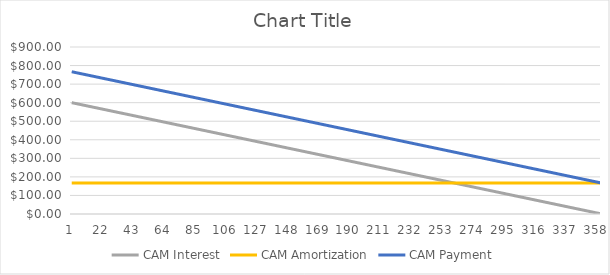
| Category | CAM Interest | CAM Amortization | CAM Payment |
|---|---|---|---|
| 0 | 600 | 166.667 | 766.667 |
| 1 | 598.333 | 166.667 | 765 |
| 2 | 596.667 | 166.667 | 763.333 |
| 3 | 595 | 166.667 | 761.667 |
| 4 | 593.333 | 166.667 | 760 |
| 5 | 591.667 | 166.667 | 758.333 |
| 6 | 590 | 166.667 | 756.667 |
| 7 | 588.333 | 166.667 | 755 |
| 8 | 586.667 | 166.667 | 753.333 |
| 9 | 585 | 166.667 | 751.667 |
| 10 | 583.333 | 166.667 | 750 |
| 11 | 581.667 | 166.667 | 748.333 |
| 12 | 580 | 166.667 | 746.667 |
| 13 | 578.333 | 166.667 | 745 |
| 14 | 576.667 | 166.667 | 743.333 |
| 15 | 575 | 166.667 | 741.667 |
| 16 | 573.333 | 166.667 | 740 |
| 17 | 571.667 | 166.667 | 738.333 |
| 18 | 570 | 166.667 | 736.667 |
| 19 | 568.333 | 166.667 | 735 |
| 20 | 566.667 | 166.667 | 733.333 |
| 21 | 565 | 166.667 | 731.667 |
| 22 | 563.333 | 166.667 | 730 |
| 23 | 561.667 | 166.667 | 728.333 |
| 24 | 560 | 166.667 | 726.667 |
| 25 | 558.333 | 166.667 | 725 |
| 26 | 556.667 | 166.667 | 723.333 |
| 27 | 555 | 166.667 | 721.667 |
| 28 | 553.333 | 166.667 | 720 |
| 29 | 551.667 | 166.667 | 718.333 |
| 30 | 550 | 166.667 | 716.667 |
| 31 | 548.333 | 166.667 | 715 |
| 32 | 546.667 | 166.667 | 713.333 |
| 33 | 545 | 166.667 | 711.667 |
| 34 | 543.333 | 166.667 | 710 |
| 35 | 541.667 | 166.667 | 708.333 |
| 36 | 540 | 166.667 | 706.667 |
| 37 | 538.333 | 166.667 | 705 |
| 38 | 536.667 | 166.667 | 703.333 |
| 39 | 535 | 166.667 | 701.667 |
| 40 | 533.333 | 166.667 | 700 |
| 41 | 531.667 | 166.667 | 698.333 |
| 42 | 530 | 166.667 | 696.667 |
| 43 | 528.333 | 166.667 | 695 |
| 44 | 526.667 | 166.667 | 693.333 |
| 45 | 525 | 166.667 | 691.667 |
| 46 | 523.333 | 166.667 | 690 |
| 47 | 521.667 | 166.667 | 688.333 |
| 48 | 520 | 166.667 | 686.667 |
| 49 | 518.333 | 166.667 | 685 |
| 50 | 516.667 | 166.667 | 683.333 |
| 51 | 515 | 166.667 | 681.667 |
| 52 | 513.333 | 166.667 | 680 |
| 53 | 511.667 | 166.667 | 678.333 |
| 54 | 510 | 166.667 | 676.667 |
| 55 | 508.333 | 166.667 | 675 |
| 56 | 506.667 | 166.667 | 673.333 |
| 57 | 505 | 166.667 | 671.667 |
| 58 | 503.333 | 166.667 | 670 |
| 59 | 501.667 | 166.667 | 668.333 |
| 60 | 500 | 166.667 | 666.667 |
| 61 | 498.333 | 166.667 | 665 |
| 62 | 496.667 | 166.667 | 663.333 |
| 63 | 495 | 166.667 | 661.667 |
| 64 | 493.333 | 166.667 | 660 |
| 65 | 491.667 | 166.667 | 658.333 |
| 66 | 490 | 166.667 | 656.667 |
| 67 | 488.333 | 166.667 | 655 |
| 68 | 486.667 | 166.667 | 653.333 |
| 69 | 485 | 166.667 | 651.667 |
| 70 | 483.333 | 166.667 | 650 |
| 71 | 481.667 | 166.667 | 648.333 |
| 72 | 480 | 166.667 | 646.667 |
| 73 | 478.333 | 166.667 | 645 |
| 74 | 476.667 | 166.667 | 643.333 |
| 75 | 475 | 166.667 | 641.667 |
| 76 | 473.333 | 166.667 | 640 |
| 77 | 471.667 | 166.667 | 638.333 |
| 78 | 470 | 166.667 | 636.667 |
| 79 | 468.333 | 166.667 | 635 |
| 80 | 466.667 | 166.667 | 633.333 |
| 81 | 465 | 166.667 | 631.667 |
| 82 | 463.333 | 166.667 | 630 |
| 83 | 461.667 | 166.667 | 628.333 |
| 84 | 460 | 166.667 | 626.667 |
| 85 | 458.333 | 166.667 | 625 |
| 86 | 456.667 | 166.667 | 623.333 |
| 87 | 455 | 166.667 | 621.667 |
| 88 | 453.333 | 166.667 | 620 |
| 89 | 451.667 | 166.667 | 618.333 |
| 90 | 450 | 166.667 | 616.667 |
| 91 | 448.333 | 166.667 | 615 |
| 92 | 446.667 | 166.667 | 613.333 |
| 93 | 445 | 166.667 | 611.667 |
| 94 | 443.333 | 166.667 | 610 |
| 95 | 441.667 | 166.667 | 608.333 |
| 96 | 440 | 166.667 | 606.667 |
| 97 | 438.333 | 166.667 | 605 |
| 98 | 436.667 | 166.667 | 603.333 |
| 99 | 435 | 166.667 | 601.667 |
| 100 | 433.333 | 166.667 | 600 |
| 101 | 431.667 | 166.667 | 598.333 |
| 102 | 430 | 166.667 | 596.667 |
| 103 | 428.333 | 166.667 | 595 |
| 104 | 426.667 | 166.667 | 593.333 |
| 105 | 425 | 166.667 | 591.667 |
| 106 | 423.333 | 166.667 | 590 |
| 107 | 421.667 | 166.667 | 588.333 |
| 108 | 420 | 166.667 | 586.667 |
| 109 | 418.333 | 166.667 | 585 |
| 110 | 416.667 | 166.667 | 583.333 |
| 111 | 415 | 166.667 | 581.667 |
| 112 | 413.333 | 166.667 | 580 |
| 113 | 411.667 | 166.667 | 578.333 |
| 114 | 410 | 166.667 | 576.667 |
| 115 | 408.333 | 166.667 | 575 |
| 116 | 406.667 | 166.667 | 573.333 |
| 117 | 405 | 166.667 | 571.667 |
| 118 | 403.333 | 166.667 | 570 |
| 119 | 401.667 | 166.667 | 568.333 |
| 120 | 400 | 166.667 | 566.667 |
| 121 | 398.333 | 166.667 | 565 |
| 122 | 396.667 | 166.667 | 563.333 |
| 123 | 395 | 166.667 | 561.667 |
| 124 | 393.333 | 166.667 | 560 |
| 125 | 391.667 | 166.667 | 558.333 |
| 126 | 390 | 166.667 | 556.667 |
| 127 | 388.333 | 166.667 | 555 |
| 128 | 386.667 | 166.667 | 553.333 |
| 129 | 385 | 166.667 | 551.667 |
| 130 | 383.333 | 166.667 | 550 |
| 131 | 381.667 | 166.667 | 548.333 |
| 132 | 380 | 166.667 | 546.667 |
| 133 | 378.333 | 166.667 | 545 |
| 134 | 376.667 | 166.667 | 543.333 |
| 135 | 375 | 166.667 | 541.667 |
| 136 | 373.333 | 166.667 | 540 |
| 137 | 371.667 | 166.667 | 538.333 |
| 138 | 370 | 166.667 | 536.667 |
| 139 | 368.333 | 166.667 | 535 |
| 140 | 366.667 | 166.667 | 533.333 |
| 141 | 365 | 166.667 | 531.667 |
| 142 | 363.333 | 166.667 | 530 |
| 143 | 361.667 | 166.667 | 528.333 |
| 144 | 360 | 166.667 | 526.667 |
| 145 | 358.333 | 166.667 | 525 |
| 146 | 356.667 | 166.667 | 523.333 |
| 147 | 355 | 166.667 | 521.667 |
| 148 | 353.333 | 166.667 | 520 |
| 149 | 351.667 | 166.667 | 518.333 |
| 150 | 350 | 166.667 | 516.667 |
| 151 | 348.333 | 166.667 | 515 |
| 152 | 346.667 | 166.667 | 513.333 |
| 153 | 345 | 166.667 | 511.667 |
| 154 | 343.333 | 166.667 | 510 |
| 155 | 341.667 | 166.667 | 508.333 |
| 156 | 340 | 166.667 | 506.667 |
| 157 | 338.333 | 166.667 | 505 |
| 158 | 336.667 | 166.667 | 503.333 |
| 159 | 335 | 166.667 | 501.667 |
| 160 | 333.333 | 166.667 | 500 |
| 161 | 331.667 | 166.667 | 498.333 |
| 162 | 330 | 166.667 | 496.667 |
| 163 | 328.333 | 166.667 | 495 |
| 164 | 326.667 | 166.667 | 493.333 |
| 165 | 325 | 166.667 | 491.667 |
| 166 | 323.333 | 166.667 | 490 |
| 167 | 321.667 | 166.667 | 488.333 |
| 168 | 320 | 166.667 | 486.667 |
| 169 | 318.333 | 166.667 | 485 |
| 170 | 316.667 | 166.667 | 483.333 |
| 171 | 315 | 166.667 | 481.667 |
| 172 | 313.333 | 166.667 | 480 |
| 173 | 311.667 | 166.667 | 478.333 |
| 174 | 310 | 166.667 | 476.667 |
| 175 | 308.333 | 166.667 | 475 |
| 176 | 306.667 | 166.667 | 473.333 |
| 177 | 305 | 166.667 | 471.667 |
| 178 | 303.333 | 166.667 | 470 |
| 179 | 301.667 | 166.667 | 468.333 |
| 180 | 300 | 166.667 | 466.667 |
| 181 | 298.333 | 166.667 | 465 |
| 182 | 296.667 | 166.667 | 463.333 |
| 183 | 295 | 166.667 | 461.667 |
| 184 | 293.333 | 166.667 | 460 |
| 185 | 291.667 | 166.667 | 458.333 |
| 186 | 290 | 166.667 | 456.667 |
| 187 | 288.333 | 166.667 | 455 |
| 188 | 286.667 | 166.667 | 453.333 |
| 189 | 285 | 166.667 | 451.667 |
| 190 | 283.333 | 166.667 | 450 |
| 191 | 281.667 | 166.667 | 448.333 |
| 192 | 280 | 166.667 | 446.667 |
| 193 | 278.333 | 166.667 | 445 |
| 194 | 276.667 | 166.667 | 443.333 |
| 195 | 275 | 166.667 | 441.667 |
| 196 | 273.333 | 166.667 | 440 |
| 197 | 271.667 | 166.667 | 438.333 |
| 198 | 270 | 166.667 | 436.667 |
| 199 | 268.333 | 166.667 | 435 |
| 200 | 266.667 | 166.667 | 433.333 |
| 201 | 265 | 166.667 | 431.667 |
| 202 | 263.333 | 166.667 | 430 |
| 203 | 261.667 | 166.667 | 428.333 |
| 204 | 260 | 166.667 | 426.667 |
| 205 | 258.333 | 166.667 | 425 |
| 206 | 256.667 | 166.667 | 423.333 |
| 207 | 255 | 166.667 | 421.667 |
| 208 | 253.333 | 166.667 | 420 |
| 209 | 251.667 | 166.667 | 418.333 |
| 210 | 250 | 166.667 | 416.667 |
| 211 | 248.333 | 166.667 | 415 |
| 212 | 246.667 | 166.667 | 413.333 |
| 213 | 245 | 166.667 | 411.667 |
| 214 | 243.333 | 166.667 | 410 |
| 215 | 241.667 | 166.667 | 408.333 |
| 216 | 240 | 166.667 | 406.667 |
| 217 | 238.333 | 166.667 | 405 |
| 218 | 236.667 | 166.667 | 403.333 |
| 219 | 235 | 166.667 | 401.667 |
| 220 | 233.333 | 166.667 | 400 |
| 221 | 231.667 | 166.667 | 398.333 |
| 222 | 230 | 166.667 | 396.667 |
| 223 | 228.333 | 166.667 | 395 |
| 224 | 226.667 | 166.667 | 393.333 |
| 225 | 225 | 166.667 | 391.667 |
| 226 | 223.333 | 166.667 | 390 |
| 227 | 221.667 | 166.667 | 388.333 |
| 228 | 220 | 166.667 | 386.667 |
| 229 | 218.333 | 166.667 | 385 |
| 230 | 216.667 | 166.667 | 383.333 |
| 231 | 215 | 166.667 | 381.667 |
| 232 | 213.333 | 166.667 | 380 |
| 233 | 211.667 | 166.667 | 378.333 |
| 234 | 210 | 166.667 | 376.667 |
| 235 | 208.333 | 166.667 | 375 |
| 236 | 206.667 | 166.667 | 373.333 |
| 237 | 205 | 166.667 | 371.667 |
| 238 | 203.333 | 166.667 | 370 |
| 239 | 201.667 | 166.667 | 368.333 |
| 240 | 200 | 166.667 | 366.667 |
| 241 | 198.333 | 166.667 | 365 |
| 242 | 196.667 | 166.667 | 363.333 |
| 243 | 195 | 166.667 | 361.667 |
| 244 | 193.333 | 166.667 | 360 |
| 245 | 191.667 | 166.667 | 358.333 |
| 246 | 190 | 166.667 | 356.667 |
| 247 | 188.333 | 166.667 | 355 |
| 248 | 186.667 | 166.667 | 353.333 |
| 249 | 185 | 166.667 | 351.667 |
| 250 | 183.333 | 166.667 | 350 |
| 251 | 181.667 | 166.667 | 348.333 |
| 252 | 180 | 166.667 | 346.667 |
| 253 | 178.333 | 166.667 | 345 |
| 254 | 176.667 | 166.667 | 343.333 |
| 255 | 175 | 166.667 | 341.667 |
| 256 | 173.333 | 166.667 | 340 |
| 257 | 171.667 | 166.667 | 338.333 |
| 258 | 170 | 166.667 | 336.667 |
| 259 | 168.333 | 166.667 | 335 |
| 260 | 166.667 | 166.667 | 333.333 |
| 261 | 165 | 166.667 | 331.667 |
| 262 | 163.333 | 166.667 | 330 |
| 263 | 161.667 | 166.667 | 328.333 |
| 264 | 160 | 166.667 | 326.667 |
| 265 | 158.333 | 166.667 | 325 |
| 266 | 156.667 | 166.667 | 323.333 |
| 267 | 155 | 166.667 | 321.667 |
| 268 | 153.333 | 166.667 | 320 |
| 269 | 151.667 | 166.667 | 318.333 |
| 270 | 150 | 166.667 | 316.667 |
| 271 | 148.333 | 166.667 | 315 |
| 272 | 146.667 | 166.667 | 313.333 |
| 273 | 145 | 166.667 | 311.667 |
| 274 | 143.333 | 166.667 | 310 |
| 275 | 141.667 | 166.667 | 308.333 |
| 276 | 140 | 166.667 | 306.667 |
| 277 | 138.333 | 166.667 | 305 |
| 278 | 136.667 | 166.667 | 303.333 |
| 279 | 135 | 166.667 | 301.667 |
| 280 | 133.333 | 166.667 | 300 |
| 281 | 131.667 | 166.667 | 298.333 |
| 282 | 130 | 166.667 | 296.667 |
| 283 | 128.333 | 166.667 | 295 |
| 284 | 126.667 | 166.667 | 293.333 |
| 285 | 125 | 166.667 | 291.667 |
| 286 | 123.333 | 166.667 | 290 |
| 287 | 121.667 | 166.667 | 288.333 |
| 288 | 120 | 166.667 | 286.667 |
| 289 | 118.333 | 166.667 | 285 |
| 290 | 116.667 | 166.667 | 283.333 |
| 291 | 115 | 166.667 | 281.667 |
| 292 | 113.333 | 166.667 | 280 |
| 293 | 111.667 | 166.667 | 278.333 |
| 294 | 110 | 166.667 | 276.667 |
| 295 | 108.333 | 166.667 | 275 |
| 296 | 106.667 | 166.667 | 273.333 |
| 297 | 105 | 166.667 | 271.667 |
| 298 | 103.333 | 166.667 | 270 |
| 299 | 101.667 | 166.667 | 268.333 |
| 300 | 100 | 166.667 | 266.667 |
| 301 | 98.333 | 166.667 | 265 |
| 302 | 96.667 | 166.667 | 263.333 |
| 303 | 95 | 166.667 | 261.667 |
| 304 | 93.333 | 166.667 | 260 |
| 305 | 91.667 | 166.667 | 258.333 |
| 306 | 90 | 166.667 | 256.667 |
| 307 | 88.333 | 166.667 | 255 |
| 308 | 86.667 | 166.667 | 253.333 |
| 309 | 85 | 166.667 | 251.667 |
| 310 | 83.333 | 166.667 | 250 |
| 311 | 81.667 | 166.667 | 248.333 |
| 312 | 80 | 166.667 | 246.667 |
| 313 | 78.333 | 166.667 | 245 |
| 314 | 76.667 | 166.667 | 243.333 |
| 315 | 75 | 166.667 | 241.667 |
| 316 | 73.333 | 166.667 | 240 |
| 317 | 71.667 | 166.667 | 238.333 |
| 318 | 70 | 166.667 | 236.667 |
| 319 | 68.333 | 166.667 | 235 |
| 320 | 66.667 | 166.667 | 233.333 |
| 321 | 65 | 166.667 | 231.667 |
| 322 | 63.333 | 166.667 | 230 |
| 323 | 61.667 | 166.667 | 228.333 |
| 324 | 60 | 166.667 | 226.667 |
| 325 | 58.333 | 166.667 | 225 |
| 326 | 56.667 | 166.667 | 223.333 |
| 327 | 55 | 166.667 | 221.667 |
| 328 | 53.333 | 166.667 | 220 |
| 329 | 51.667 | 166.667 | 218.333 |
| 330 | 50 | 166.667 | 216.667 |
| 331 | 48.333 | 166.667 | 215 |
| 332 | 46.667 | 166.667 | 213.333 |
| 333 | 45 | 166.667 | 211.667 |
| 334 | 43.333 | 166.667 | 210 |
| 335 | 41.667 | 166.667 | 208.333 |
| 336 | 40 | 166.667 | 206.667 |
| 337 | 38.333 | 166.667 | 205 |
| 338 | 36.667 | 166.667 | 203.333 |
| 339 | 35 | 166.667 | 201.667 |
| 340 | 33.333 | 166.667 | 200 |
| 341 | 31.667 | 166.667 | 198.333 |
| 342 | 30 | 166.667 | 196.667 |
| 343 | 28.333 | 166.667 | 195 |
| 344 | 26.667 | 166.667 | 193.333 |
| 345 | 25 | 166.667 | 191.667 |
| 346 | 23.333 | 166.667 | 190 |
| 347 | 21.667 | 166.667 | 188.333 |
| 348 | 20 | 166.667 | 186.667 |
| 349 | 18.333 | 166.667 | 185 |
| 350 | 16.667 | 166.667 | 183.333 |
| 351 | 15 | 166.667 | 181.667 |
| 352 | 13.333 | 166.667 | 180 |
| 353 | 11.667 | 166.667 | 178.333 |
| 354 | 10 | 166.667 | 176.667 |
| 355 | 8.333 | 166.667 | 175 |
| 356 | 6.667 | 166.667 | 173.333 |
| 357 | 5 | 166.667 | 171.667 |
| 358 | 3.333 | 166.667 | 170 |
| 359 | 1.667 | 166.667 | 168.333 |